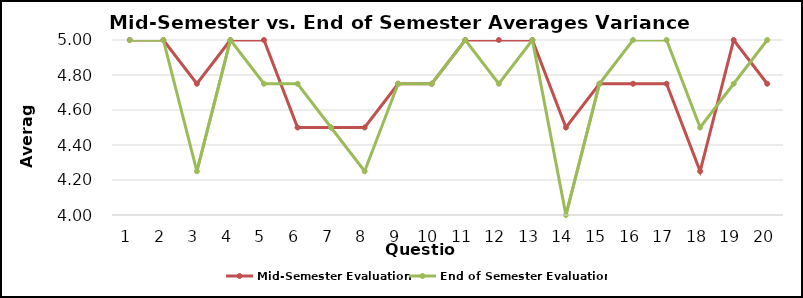
| Category | Mid-Semester Evaluation | End of Semester Evaluation |
|---|---|---|
| 0 | 5 | 5 |
| 1 | 5 | 5 |
| 2 | 4.75 | 4.25 |
| 3 | 5 | 5 |
| 4 | 5 | 4.75 |
| 5 | 4.5 | 4.75 |
| 6 | 4.5 | 4.5 |
| 7 | 4.5 | 4.25 |
| 8 | 4.75 | 4.75 |
| 9 | 4.75 | 4.75 |
| 10 | 5 | 5 |
| 11 | 5 | 4.75 |
| 12 | 5 | 5 |
| 13 | 4.5 | 4 |
| 14 | 4.75 | 4.75 |
| 15 | 4.75 | 5 |
| 16 | 4.75 | 5 |
| 17 | 4.25 | 4.5 |
| 18 | 5 | 4.75 |
| 19 | 4.75 | 5 |